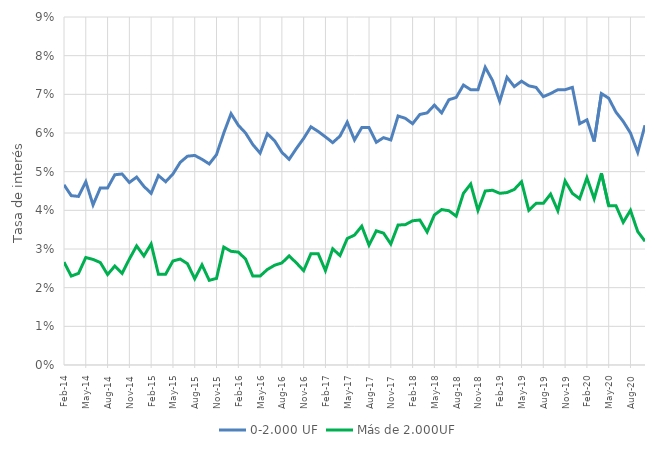
| Category | 0-2.000 UF | Más de 2.000UF |
|---|---|---|
| 2014-02-01 | 0.047 | 0.027 |
| 2014-03-01 | 0.044 | 0.023 |
| 2014-04-01 | 0.044 | 0.024 |
| 2014-05-01 | 0.047 | 0.028 |
| 2014-06-01 | 0.041 | 0.027 |
| 2014-07-01 | 0.046 | 0.026 |
| 2014-08-01 | 0.046 | 0.023 |
| 2014-09-01 | 0.049 | 0.026 |
| 2014-10-01 | 0.049 | 0.024 |
| 2014-11-01 | 0.047 | 0.027 |
| 2014-12-01 | 0.049 | 0.031 |
| 2015-01-01 | 0.046 | 0.028 |
| 2015-02-01 | 0.044 | 0.031 |
| 2015-03-01 | 0.049 | 0.024 |
| 2015-04-01 | 0.047 | 0.024 |
| 2015-05-01 | 0.049 | 0.027 |
| 2015-06-01 | 0.052 | 0.027 |
| 2015-07-01 | 0.054 | 0.026 |
| 2015-08-01 | 0.054 | 0.022 |
| 2015-09-01 | 0.053 | 0.026 |
| 2015-10-01 | 0.052 | 0.022 |
| 2015-11-01 | 0.054 | 0.022 |
| 2015-12-01 | 0.06 | 0.03 |
| 2016-01-01 | 0.065 | 0.029 |
| 2016-02-01 | 0.062 | 0.029 |
| 2016-03-01 | 0.06 | 0.027 |
| 2016-04-01 | 0.057 | 0.023 |
| 2016-05-01 | 0.055 | 0.023 |
| 2016-06-01 | 0.06 | 0.025 |
| 2016-07-01 | 0.058 | 0.026 |
| 2016-08-01 | 0.055 | 0.026 |
| 2016-09-01 | 0.053 | 0.028 |
| 2016-10-01 | 0.056 | 0.026 |
| 2016-11-01 | 0.059 | 0.024 |
| 2016-12-01 | 0.062 | 0.029 |
| 2017-01-01 | 0.06 | 0.029 |
| 2017-02-01 | 0.059 | 0.024 |
| 2017-03-01 | 0.058 | 0.03 |
| 2017-04-01 | 0.059 | 0.028 |
| 2017-05-01 | 0.063 | 0.033 |
| 2017-06-01 | 0.058 | 0.034 |
| 2017-07-01 | 0.061 | 0.036 |
| 2017-08-01 | 0.061 | 0.031 |
| 2017-09-01 | 0.058 | 0.035 |
| 2017-10-01 | 0.059 | 0.034 |
| 2017-11-01 | 0.058 | 0.031 |
| 2017-12-01 | 0.064 | 0.036 |
| 2018-01-01 | 0.064 | 0.036 |
| 2018-02-01 | 0.062 | 0.037 |
| 2018-03-01 | 0.065 | 0.038 |
| 2018-04-01 | 0.065 | 0.034 |
| 2018-05-01 | 0.067 | 0.039 |
| 2018-06-01 | 0.065 | 0.04 |
| 2018-07-01 | 0.069 | 0.04 |
| 2018-08-01 | 0.069 | 0.038 |
| 2018-09-01 | 0.072 | 0.044 |
| 2018-10-01 | 0.071 | 0.047 |
| 2018-11-01 | 0.071 | 0.04 |
| 2018-12-01 | 0.077 | 0.045 |
| 2019-01-01 | 0.074 | 0.045 |
| 2019-02-01 | 0.068 | 0.044 |
| 2019-03-01 | 0.074 | 0.045 |
| 2019-04-01 | 0.072 | 0.045 |
| 2019-05-01 | 0.073 | 0.047 |
| 2019-06-01 | 0.072 | 0.04 |
| 2019-07-01 | 0.072 | 0.042 |
| 2019-08-01 | 0.069 | 0.042 |
| 2019-09-01 | 0.07 | 0.044 |
| 2019-10-01 | 0.071 | 0.04 |
| 2019-11-01 | 0.071 | 0.048 |
| 2019-12-01 | 0.072 | 0.044 |
| 2020-01-01 | 0.062 | 0.043 |
| 2020-02-01 | 0.063 | 0.048 |
| 2020-03-01 | 0.058 | 0.043 |
| 2020-04-01 | 0.07 | 0.05 |
| 2020-05-01 | 0.069 | 0.041 |
| 2020-06-01 | 0.065 | 0.041 |
| 2020-07-01 | 0.063 | 0.037 |
| 2020-08-01 | 0.06 | 0.04 |
| 2020-09-01 | 0.055 | 0.034 |
| 2020-10-01 | 0.062 | 0.032 |